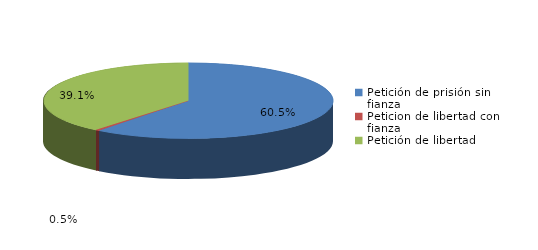
| Category | Series 0 |
|---|---|
| Petición de prisión sin fianza | 130 |
| Peticion de libertad con fianza | 1 |
| Petición de libertad | 84 |